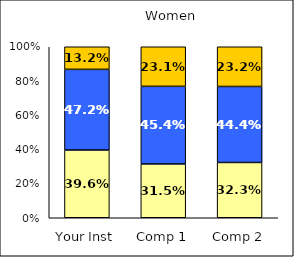
| Category | Low Institutional Priority: Commitment to Diversity | Average Institutional Priority: Commitment to Diversity | High Institutional Priority: Commitment to Diversity |
|---|---|---|---|
| Your Inst | 0.396 | 0.472 | 0.132 |
| Comp 1 | 0.315 | 0.454 | 0.231 |
| Comp 2 | 0.323 | 0.444 | 0.232 |